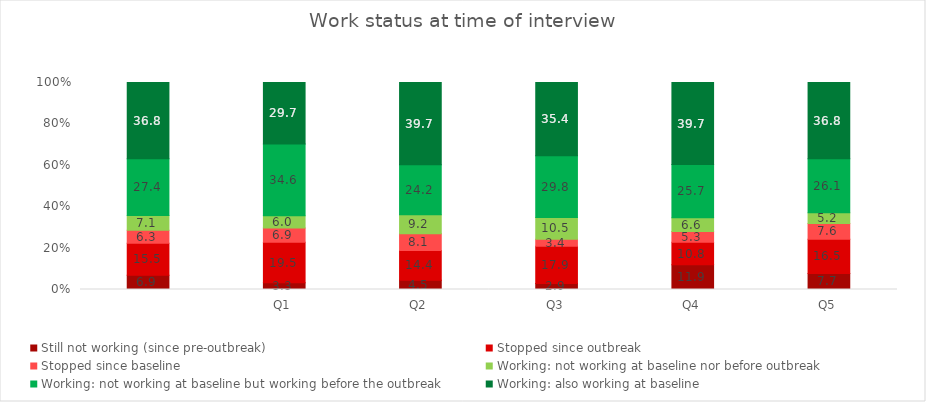
| Category | Still not working (since pre-outbreak) | Stopped since outbreak | Stopped since baseline | Working: not working at baseline nor before outbreak | Working: not working at baseline but working before the outbreak | Working: also working at baseline |
|---|---|---|---|---|---|---|
|  | 6.873 | 15.49 | 6.317 | 7.111 | 27.411 | 36.799 |
| Q1 | 3.263 | 19.538 | 6.869 | 6.009 | 34.606 | 29.716 |
| Q2 | 4.47 | 14.356 | 8.104 | 9.228 | 24.159 | 39.683 |
| Q3 | 2.925 | 17.91 | 3.427 | 10.533 | 29.801 | 35.405 |
| Q4 | 11.925 | 10.841 | 5.284 | 6.552 | 25.738 | 39.659 |
| Q5 | 7.746 | 16.508 | 7.649 | 5.153 | 26.098 | 36.846 |